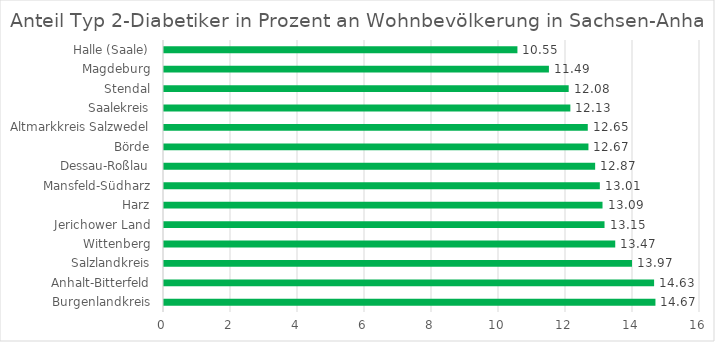
| Category | Anteil Typ 2-Diabetiker in Prozent an Wohnbevölkerung in Sachsen-Anhalt |
|---|---|
| Burgenlandkreis | 14.67 |
| Anhalt-Bitterfeld | 14.63 |
| Salzlandkreis | 13.97 |
| Wittenberg | 13.47 |
| Jerichower Land | 13.15 |
| Harz | 13.09 |
| Mansfeld-Südharz | 13.01 |
| Dessau-Roßlau | 12.87 |
| Börde | 12.67 |
| Altmarkkreis Salzwedel | 12.65 |
| Saalekreis | 12.13 |
| Stendal | 12.08 |
| Magdeburg | 11.49 |
| Halle (Saale) | 10.55 |